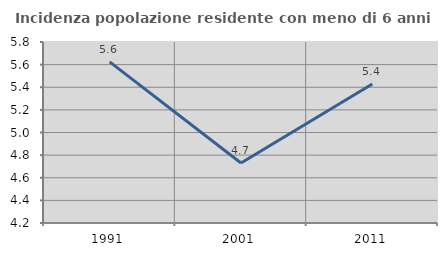
| Category | Incidenza popolazione residente con meno di 6 anni |
|---|---|
| 1991.0 | 5.624 |
| 2001.0 | 4.73 |
| 2011.0 | 5.429 |